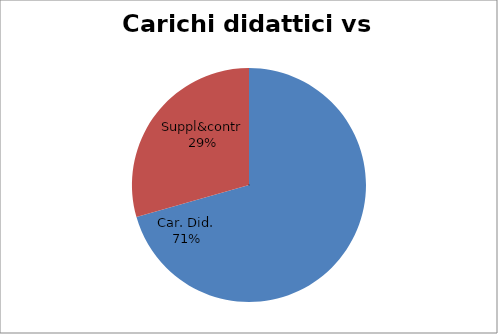
| Category | Series 0 |
|---|---|
| Car. Did. | 0.706 |
| Suppl&contr | 0.294 |